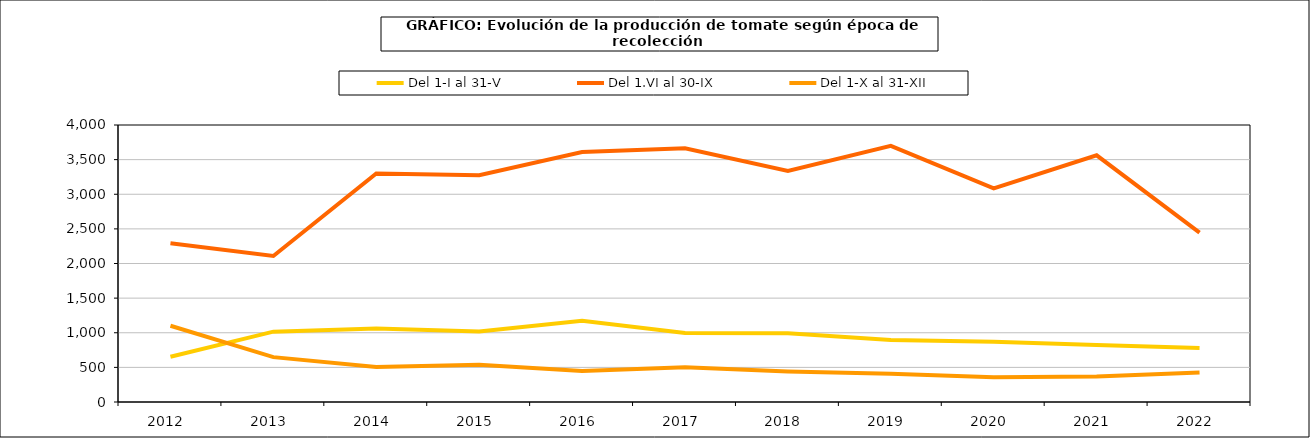
| Category | Del 1-I al 31-V | Del 1.VI al 30-IX | Del 1-X al 31-XII |
|---|---|---|---|
| 2012.0 | 652.744 | 2292.602 | 1101.067 |
| 2013.0 | 1015.956 | 2108.99 | 647.9 |
| 2014.0 | 1061.306 | 3300.096 | 504.058 |
| 2015.0 | 1017.886 | 3275.48 | 539.334 |
| 2016.0 | 1174.446 | 3611.158 | 447.938 |
| 2017.0 | 995.505 | 3664.966 | 502.995 |
| 2018.0 | 991.845 | 3336.107 | 440.643 |
| 2019.0 | 894.568 | 3698.699 | 407.292 |
| 2020.0 | 870.627 | 3084.921 | 357.347 |
| 2021.0 | 823.93 | 3562.768 | 367.682 |
| 2022.0 | 780.091 | 2447.049 | 424.804 |